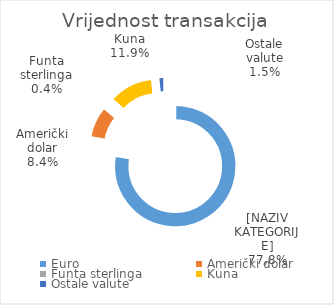
| Category | Series 0 |
|---|---|
| Euro | 212611360199 |
| Američki dolar | 23112353071 |
| Funta sterlinga | 1222031189 |
| Kuna | 32540470975 |
| Ostale valute | 4212407516 |